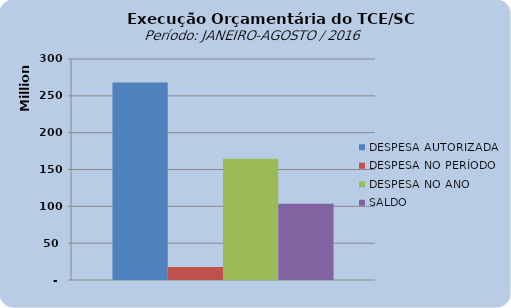
| Category | DESPESA AUTORIZADA | DESPESA NO PERÍODO | DESPESA NO ANO | SALDO |
|---|---|---|---|---|
| 0 | 268048627.5 | 17514159.47 | 164663544.92 | 103385082.58 |